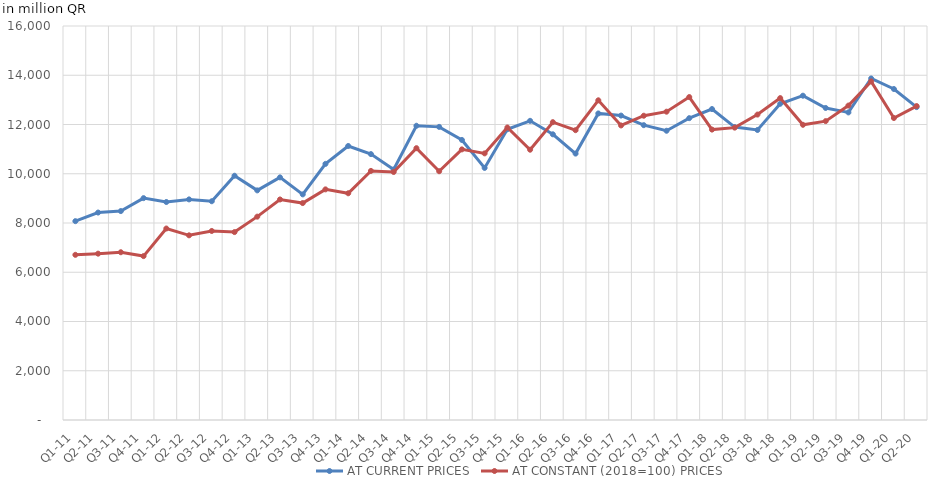
| Category | AT CURRENT PRICES | AT CONSTANT (2018=100) PRICES |
|---|---|---|
| Q1-11 | 8074.677 | 6707.569 |
| Q2-11 | 8424.242 | 6754.669 |
| Q3-11 | 8484.264 | 6812.504 |
| Q4-11 | 9009.348 | 6655.948 |
| Q1-12 | 8852.721 | 7775.866 |
| Q2-12 | 8958.866 | 7499.709 |
| Q3-12 | 8883.589 | 7676.685 |
| Q4-12 | 9919.334 | 7631.357 |
| Q1-13 | 9325.022 | 8257.653 |
| Q2-13 | 9852.571 | 8955.944 |
| Q3-13 | 9162.335 | 8809.289 |
| Q4-13 | 10401.228 | 9365.677 |
| Q1-14 | 11127.5 | 9207.03 |
| Q2-14 | 10798.113 | 10115.484 |
| Q3-14 | 10172.965 | 10071.694 |
| Q4-14 | 11948.882 | 11038.444 |
| Q1-15 | 11903.55 | 10102.405 |
| Q2-15 | 11372.212 | 10989.498 |
| Q3-15 | 10237.313 | 10826.844 |
| Q4-15 | 11807.04 | 11878.801 |
| Q1-16 | 12148.982 | 10976.035 |
| Q2-16 | 11601.405 | 12094.352 |
| Q3-16 | 10819.068 | 11769.185 |
| Q4-16 | 12449.116 | 12982.425 |
| Q1-17 | 12362.111 | 11961.292 |
| Q2-17 | 11972.964 | 12356.166 |
| Q3-17 | 11746.057 | 12520.219 |
| Q4-17 | 12257.815 | 13114.47 |
| Q1-18 | 12627.427 | 11793.736 |
| Q2-18 | 11895.223 | 11872.963 |
| Q3-18 | 11777.076 | 12402.959 |
| Q4-18 | 12841.801 | 13071.868 |
| Q1-19 | 13169.74 | 11987.868 |
| Q2-19 | 12671.658 | 12137.095 |
| Q3-19 | 12490.316 | 12768.536 |
| Q4-19 | 13869.504 | 13749.873 |
| Q1-20 | 13441.206 | 12263.09 |
| Q2-20 | 12706.384 | 12748.691 |